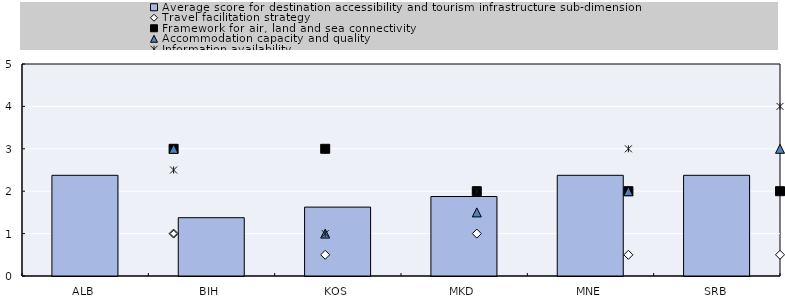
| Category | Average score for destination accessibility and tourism infrastructure sub-dimension |
|---|---|
| ALB | 2.375 |
| BIH | 1.375 |
| KOS | 1.625 |
| MKD | 1.875 |
| MNE | 2.375 |
| SRB | 2.375 |